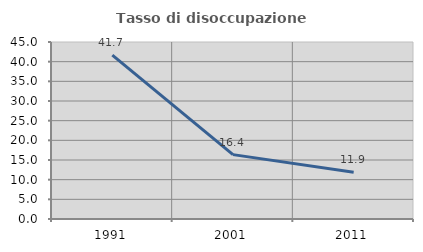
| Category | Tasso di disoccupazione giovanile  |
|---|---|
| 1991.0 | 41.667 |
| 2001.0 | 16.364 |
| 2011.0 | 11.905 |